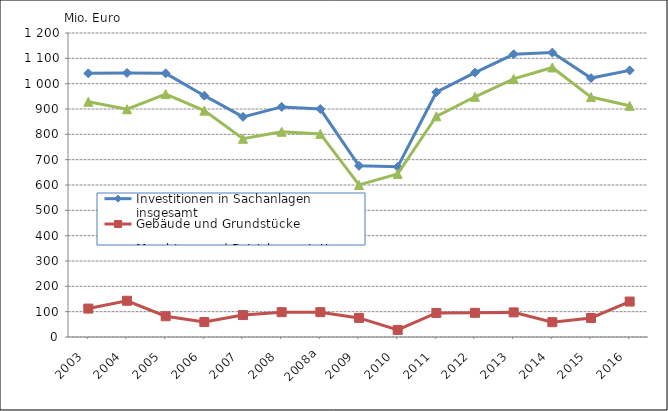
| Category | Investitionen in Sachanlagen insgesamt | Gebäude und Grundstücke | Maschinen und Betriebsausstattung |
|---|---|---|---|
| 2003  | 1040673 | 112131 | 928542 |
| 2004  | 1042199 | 143093 | 899107 |
| 2005  | 1040771 | 81943 | 958828 |
| 2006  | 952585 | 59050 | 893535 |
| 2007  | 869086 | 86618 | 782467 |
| 2008  | 908294 | 98112 | 810182 |
| 2008a | 899839 | 98112 | 801727 |
| 2009  | 675811 | 75418 | 600393 |
| 2010  | 671734.109 | 27895.396 | 643838.713 |
| 2011  | 966215.121 | 94979.882 | 871235.239 |
| 2012  | 1043637.405 | 95334.066 | 948303.339 |
| 2013  | 1115956.006 | 97198.2 | 1018757.806 |
| 2014  | 1122553.349 | 58554.558 | 1063998.791 |
| 2015  | 1022095.197 | 75014.669 | 947080.528 |
| 2016  | 1052570.21 | 139988.972 | 912581.238 |